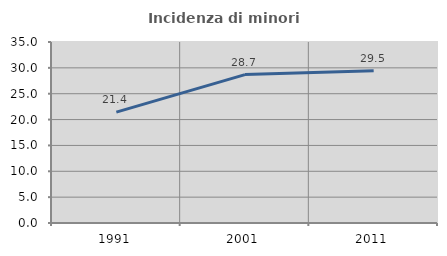
| Category | Incidenza di minori stranieri |
|---|---|
| 1991.0 | 21.429 |
| 2001.0 | 28.696 |
| 2011.0 | 29.452 |